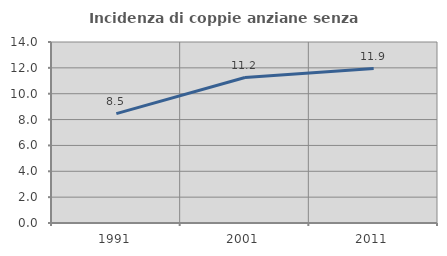
| Category | Incidenza di coppie anziane senza figli  |
|---|---|
| 1991.0 | 8.456 |
| 2001.0 | 11.249 |
| 2011.0 | 11.943 |